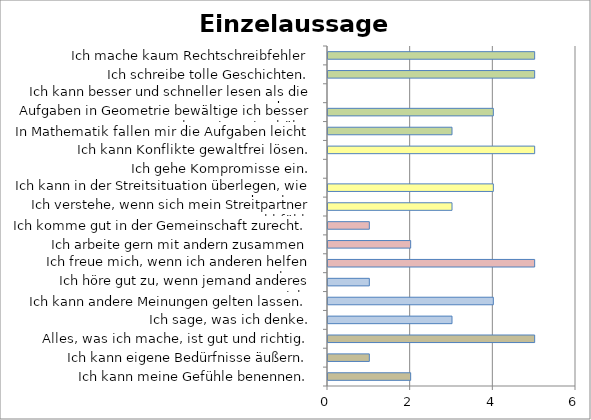
| Category | Series 0 |
|---|---|
| Ich kann meine Gefühle benennen. | 2 |
| Ich kann eigene Bedürfnisse äußern. | 1 |
| Alles, was ich mache, ist gut und richtig. | 5 |
| Ich sage, was ich denke. | 3 |
| Ich kann andere Meinungen gelten lassen. | 4 |
| Ich höre gut zu, wenn jemand anderes spricht. | 1 |
| Ich freue mich, wenn ich anderen helfen kann. | 5 |
| Ich arbeite gern mit andern zusammen | 2 |
| Ich komme gut in der Gemeinschaft zurecht. | 1 |
| Ich verstehe, wenn sich mein Streitpartner unwohl fühlt. | 3 |
| Ich kann in der Streitsituation überlegen, wie es dazu kam. | 4 |
| Ich gehe Kompromisse ein. | 0 |
| Ich kann Konflikte gewaltfrei lösen. | 5 |
| In Mathematik fallen mir die Aufgaben leicht | 3 |
| Aufgaben in Geometrie bewältige ich besser als meine Mitschüler. | 4 |
| Ich kann besser und schneller lesen als die anderen. | 0 |
| Ich schreibe tolle Geschichten. | 5 |
| Ich mache kaum Rechtschreibfehler | 5 |